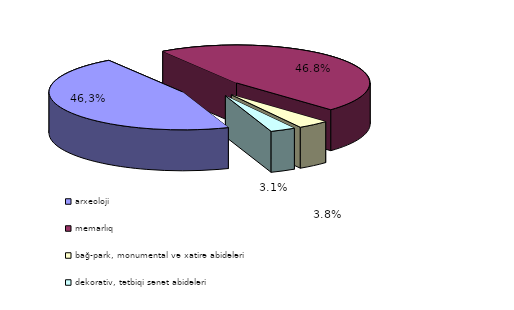
| Category | Series 0 |
|---|---|
| arxeoloji | 2542 |
| memarlıq  | 2574 |
| bağ-park, monumental və xatirə abidələri | 211 |
| dekorativ, tətbiqi sənət abidələri | 169 |